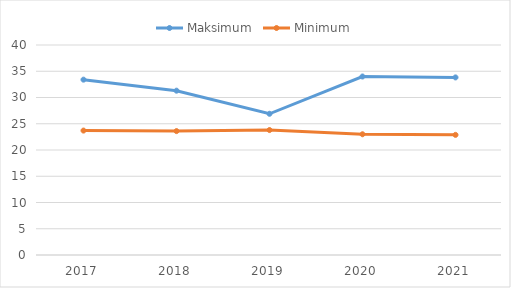
| Category | Maksimum | Minimum |
|---|---|---|
| 2017.0 | 33.4 | 23.7 |
| 2018.0 | 31.3 | 23.6 |
| 2019.0 | 26.9 | 23.8 |
| 2020.0 | 34 | 23 |
| 2021.0 | 33.825 | 22.883 |